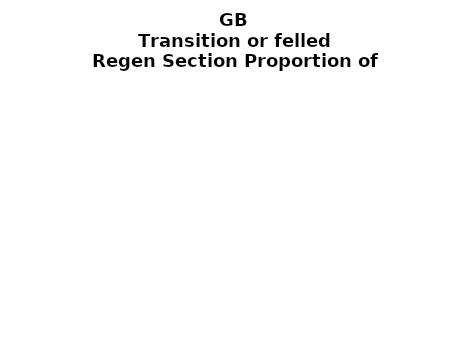
| Category | Transition or felled |
|---|---|
| None | 0.213 |
| Seedlings only | 0.003 |
| Seedlings, saplings only | 0.149 |
| Seedlings, saplings, <7 cm trees | 0.017 |
| Saplings only | 0.495 |
| <7 cm trees, seedlings only | 0 |
| <7 cm trees, saplings only | 0.099 |
| <7 cm Trees only | 0.024 |